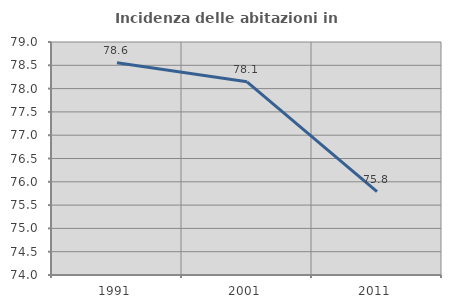
| Category | Incidenza delle abitazioni in proprietà  |
|---|---|
| 1991.0 | 78.553 |
| 2001.0 | 78.145 |
| 2011.0 | 75.787 |